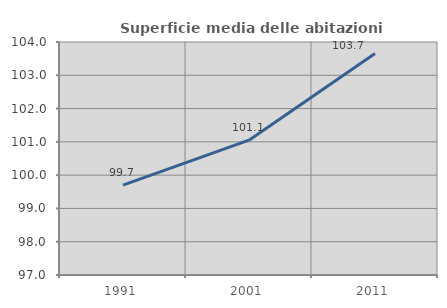
| Category | Superficie media delle abitazioni occupate |
|---|---|
| 1991.0 | 99.699 |
| 2001.0 | 101.051 |
| 2011.0 | 103.652 |